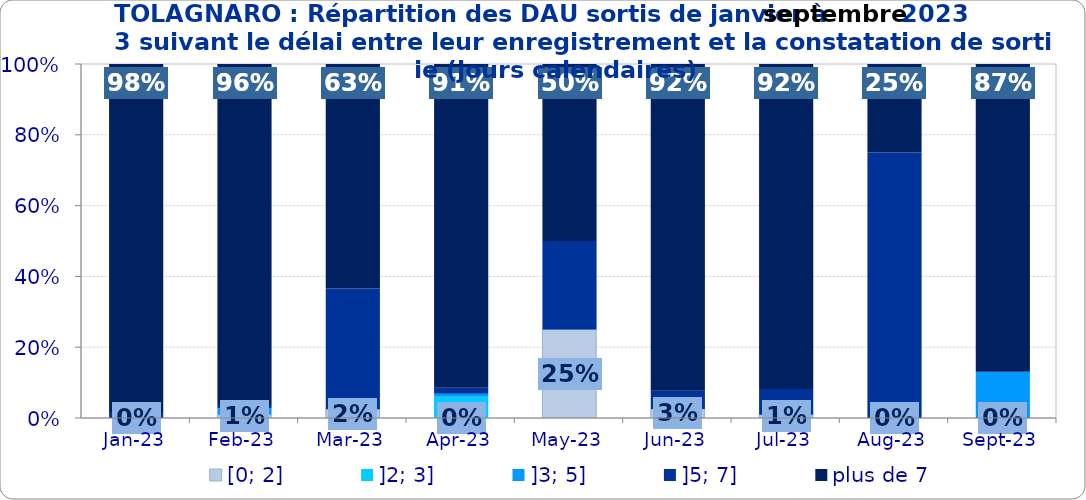
| Category | [0; 2] | ]2; 3] | ]3; 5] | ]5; 7] | plus de 7 |
|---|---|---|---|---|---|
| 2023-01-01 | 0 | 0 | 0 | 0.017 | 0.983 |
| 2023-02-01 | 0.009 | 0 | 0.019 | 0.009 | 0.963 |
| 2023-03-01 | 0.024 | 0 | 0 | 0.341 | 0.634 |
| 2023-04-01 | 0 | 0.06 | 0.009 | 0.017 | 0.915 |
| 2023-05-01 | 0.25 | 0 | 0 | 0.25 | 0.5 |
| 2023-06-01 | 0.026 | 0 | 0 | 0.051 | 0.923 |
| 2023-07-01 | 0.009 | 0 | 0 | 0.073 | 0.918 |
| 2023-08-01 | 0 | 0 | 0 | 0.75 | 0.25 |
| 2023-09-01 | 0 | 0 | 0.13 | 0 | 0.87 |